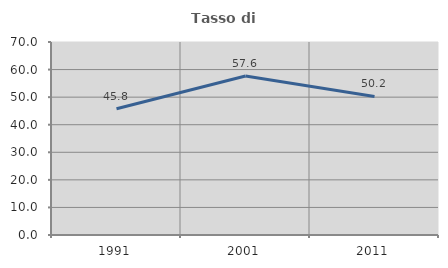
| Category | Tasso di occupazione   |
|---|---|
| 1991.0 | 45.763 |
| 2001.0 | 57.642 |
| 2011.0 | 50.235 |